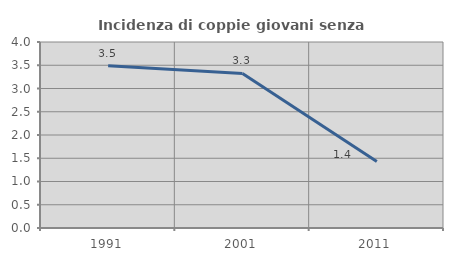
| Category | Incidenza di coppie giovani senza figli |
|---|---|
| 1991.0 | 3.488 |
| 2001.0 | 3.325 |
| 2011.0 | 1.433 |